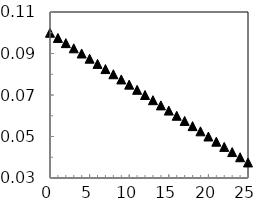
| Category | Series 2 |
|---|---|
| 0.0 | 0.1 |
| 1.0 | 0.098 |
| 2.0 | 0.095 |
| 3.0 | 0.092 |
| 4.0 | 0.09 |
| 5.0 | 0.088 |
| 6.0 | 0.085 |
| 7.0 | 0.082 |
| 8.0 | 0.08 |
| 9.0 | 0.078 |
| 10.0 | 0.075 |
| 11.0 | 0.072 |
| 12.0 | 0.07 |
| 13.0 | 0.068 |
| 14.0 | 0.065 |
| 15.0 | 0.062 |
| 16.0 | 0.06 |
| 17.0 | 0.058 |
| 18.0 | 0.055 |
| 19.0 | 0.052 |
| 20.0 | 0.05 |
| 21.0 | 0.048 |
| 22.0 | 0.045 |
| 23.0 | 0.042 |
| 24.0 | 0.04 |
| 25.0 | 0.038 |